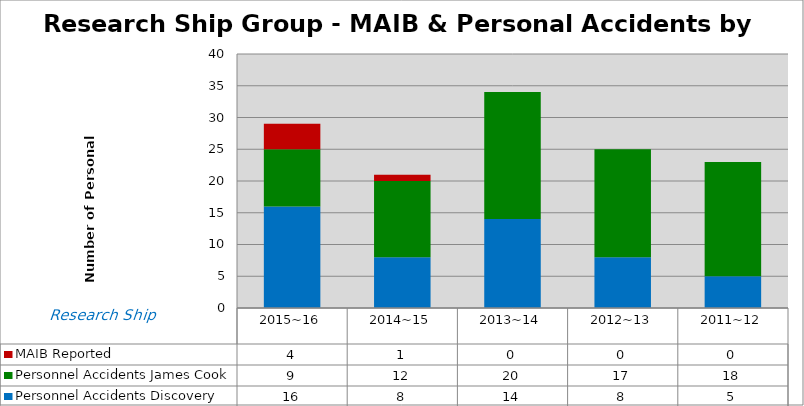
| Category | Personnel Accidents | MAIB Reported |
|---|---|---|
| 2015~16 | 9 | 4 |
| 2014~15 | 12 | 1 |
| 2013~14 | 20 | 0 |
| 2012~13 | 17 | 0 |
| 2011~12 | 18 | 0 |